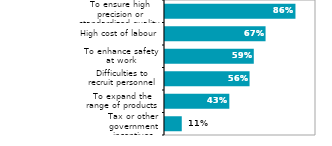
| Category | Series 0 |
|---|---|
| Tax or other government incentives | 0.111 |
| To expand the range of products | 0.426 |
| Difficulties to recruit personnel | 0.56 |
| To enhance safety at work | 0.588 |
| High cost of labour | 0.666 |
| To ensure high precision or standardized quality of products | 0.864 |